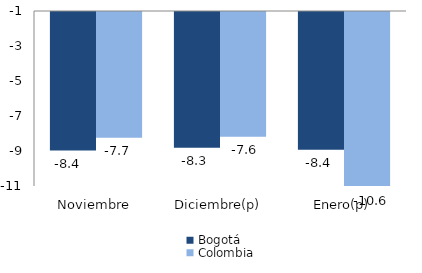
| Category | Bogotá | Colombia |
|---|---|---|
| Noviembre | -8.415 | -7.685 |
| Diciembre(p) | -8.259 | -7.635 |
| Enero(p) | -8.366 | -10.576 |